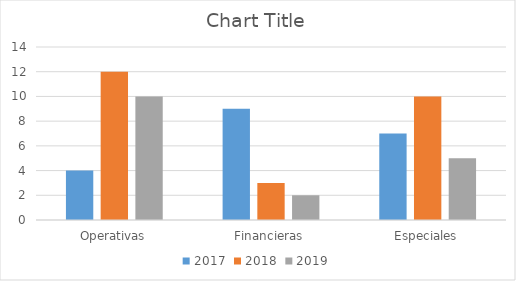
| Category | 2017 | 2018 | 2019 |
|---|---|---|---|
| Operativas | 4 | 12 | 10 |
| Financieras | 9 | 3 | 2 |
| Especiales | 7 | 10 | 5 |